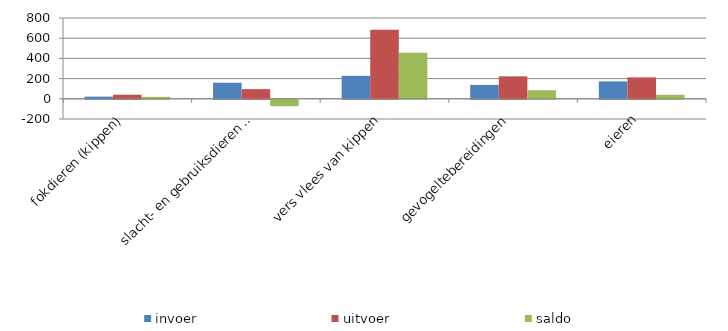
| Category | invoer | uitvoer | saldo |
|---|---|---|---|
|    fokdieren (kippen) | 21.157 | 40.428 | 19.272 |
|    slacht- en gebruiksdieren (hanen en kippen) | 159.177 | 95.806 | -63.371 |
| vers vlees van kippen | 227.367 | 684.026 | 456.659 |
| gevogeltebereidingen | 137.398 | 222.214 | 84.816 |
| eieren | 172.188 | 212.032 | 39.843 |